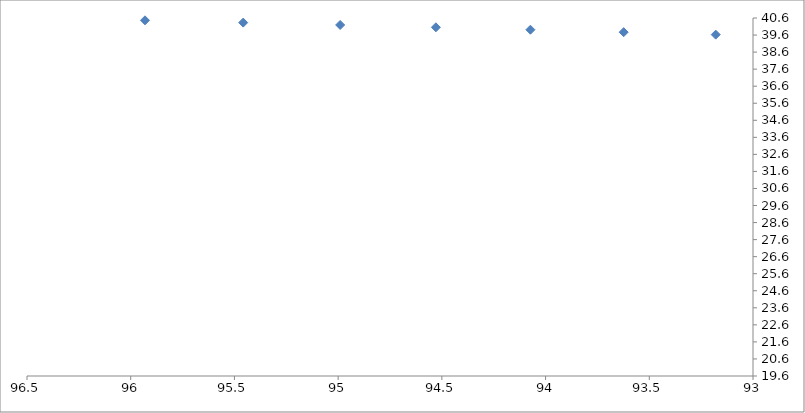
| Category | Series 0 |
|---|---|
| 95.93108340000026 | 40.464 |
| 95.4577001777775 | 40.329 |
| 94.99024251111086 | 40.192 |
| 94.52871039999945 | 40.053 |
| 94.07310384444372 | 39.912 |
| 93.62342284444458 | 39.769 |
| 93.1796674000002 | 39.625 |